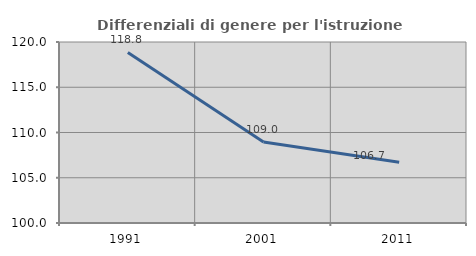
| Category | Differenziali di genere per l'istruzione superiore |
|---|---|
| 1991.0 | 118.844 |
| 2001.0 | 108.953 |
| 2011.0 | 106.704 |